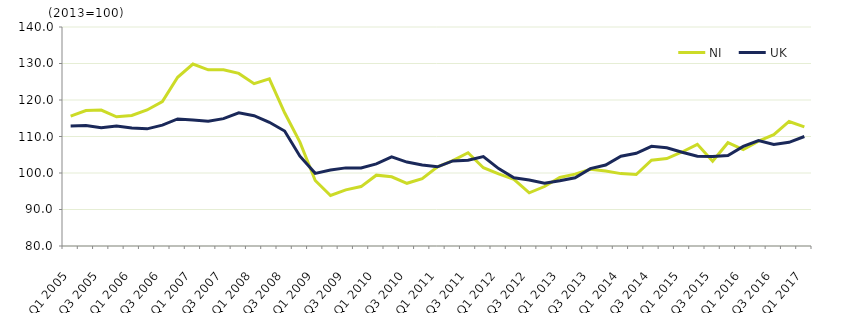
| Category | NI  | UK  |
|---|---|---|
| Q1 2005 | 115.585 | 112.9 |
| Q2 2005 | 117.101 | 113 |
| Q3 2005 | 117.252 | 112.4 |
| Q4 2005 | 115.387 | 112.9 |
| Q1 2006 | 115.758 | 112.3 |
| Q2 2006 | 117.27 | 112.1 |
| Q3 2006 | 119.58 | 113.1 |
| Q4 2006 | 126.229 | 114.8 |
| Q1 2007 | 129.851 | 114.5 |
| Q2 2007 | 128.269 | 114.2 |
| Q3 2007 | 128.297 | 114.9 |
| Q4 2007 | 127.289 | 116.5 |
| Q1 2008 | 124.482 | 115.7 |
| Q2 2008 | 125.8 | 113.9 |
| Q3 2008 | 116.491 | 111.5 |
| Q4 2008 | 108.458 | 104.6 |
| Q1 2009 | 97.946 | 99.9 |
| Q2 2009 | 93.846 | 100.8 |
| Q3 2009 | 95.372 | 101.4 |
| Q4 2009 | 96.279 | 101.4 |
| Q1 2010 | 99.404 | 102.5 |
| Q2 2010 | 98.956 | 104.4 |
| Q3 2010 | 97.179 | 103 |
| Q4 2010 | 98.459 | 102.2 |
| Q1 2011 | 101.707 | 101.7 |
| Q2 2011 | 103.39 | 103.3 |
| Q3 2011 | 105.551 | 103.5 |
| Q4 2011 | 101.451 | 104.5 |
| Q1 2012 | 99.775 | 101.2 |
| Q2 2012 | 98.273 | 98.7 |
| Q3 2012 | 94.559 | 98.1 |
| Q4 2012 | 96.296 | 97.2 |
| Q1 2013 | 98.781 | 97.9 |
| Q2 2013 | 99.685 | 98.7 |
| Q3 2013 | 101 | 101.2 |
| Q4 2013 | 100.533 | 102.2 |
| Q1 2014 | 99.83 | 104.6 |
| Q2 2014 | 99.58 | 105.4 |
| Q3 2014 | 103.511 | 107.3 |
| Q4 2014 | 103.963 | 106.9 |
| Q1 2015 | 105.759 | 105.7 |
| Q2 2015 | 107.865 | 104.6 |
| Q3 2015 | 103.215 | 104.5 |
| Q4 2015 | 108.301 | 104.8 |
| Q1 2016 | 106.416 | 107.3 |
| Q2 2016 | 108.735 | 108.9 |
| Q3 2016 | 110.489 | 107.8 |
| Q4 2016 | 114.117 | 108.4 |
| Q1 2017 | 112.62 | 110 |